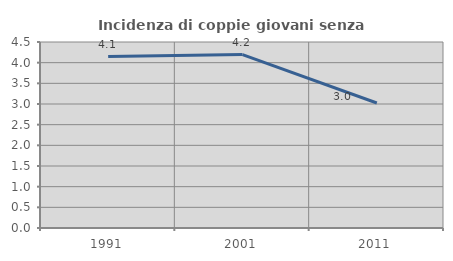
| Category | Incidenza di coppie giovani senza figli |
|---|---|
| 1991.0 | 4.147 |
| 2001.0 | 4.196 |
| 2011.0 | 3.024 |